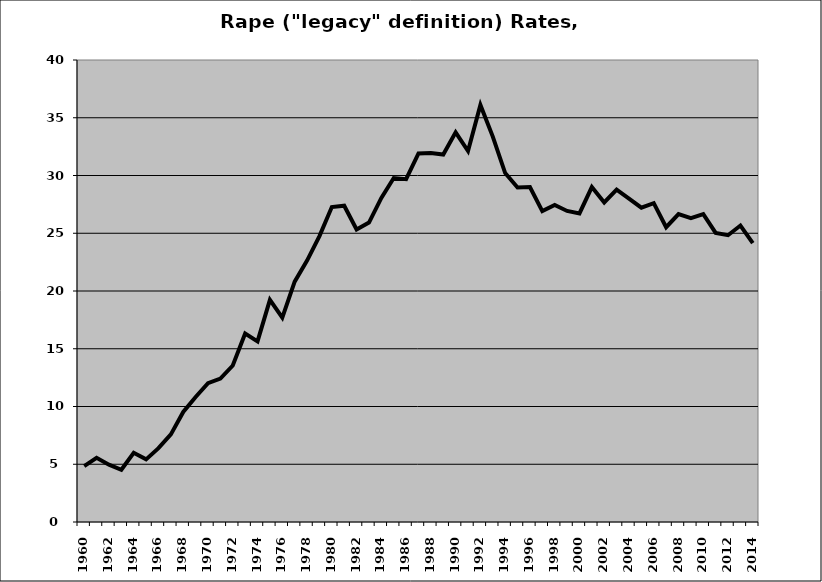
| Category | Rape |
|---|---|
| 1960.0 | 4.836 |
| 1961.0 | 5.56 |
| 1962.0 | 4.96 |
| 1963.0 | 4.523 |
| 1964.0 | 5.995 |
| 1965.0 | 5.423 |
| 1966.0 | 6.39 |
| 1967.0 | 7.582 |
| 1968.0 | 9.527 |
| 1969.0 | 10.829 |
| 1970.0 | 12.023 |
| 1971.0 | 12.418 |
| 1972.0 | 13.548 |
| 1973.0 | 16.311 |
| 1974.0 | 15.638 |
| 1975.0 | 19.235 |
| 1976.0 | 17.697 |
| 1977.0 | 20.806 |
| 1978.0 | 22.636 |
| 1979.0 | 24.753 |
| 1980.0 | 27.268 |
| 1981.0 | 27.383 |
| 1982.0 | 25.324 |
| 1983.0 | 25.923 |
| 1984.0 | 28.061 |
| 1985.0 | 29.784 |
| 1986.0 | 29.681 |
| 1987.0 | 31.904 |
| 1988.0 | 31.954 |
| 1989.0 | 31.811 |
| 1990.0 | 33.741 |
| 1991.0 | 32.121 |
| 1992.0 | 36.112 |
| 1993.0 | 33.367 |
| 1994.0 | 30.21 |
| 1995.0 | 28.959 |
| 1996.0 | 29.005 |
| 1997.0 | 26.921 |
| 1998.0 | 27.444 |
| 1999.0 | 26.93 |
| 2000.0 | 26.712 |
| 2001.0 | 28.995 |
| 2002.0 | 27.671 |
| 2003.0 | 28.783 |
| 2004.0 | 27.999 |
| 2005.0 | 27.217 |
| 2006.0 | 27.605 |
| 2007.0 | 25.52 |
| 2008.0 | 26.652 |
| 2009.0 | 26.298 |
| 2010.0 | 26.651 |
| 2011.0 | 25.034 |
| 2012.0 | 24.83 |
| 2013.0 | 25.667 |
| 2014.0 | 24.15 |